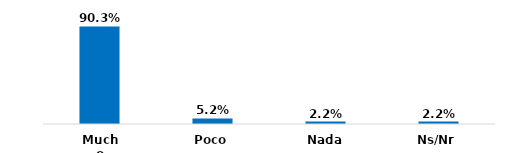
| Category | Series 0 |
|---|---|
| Mucho | 0.903 |
| Poco | 0.052 |
| Nada | 0.022 |
| Ns/Nr | 0.022 |